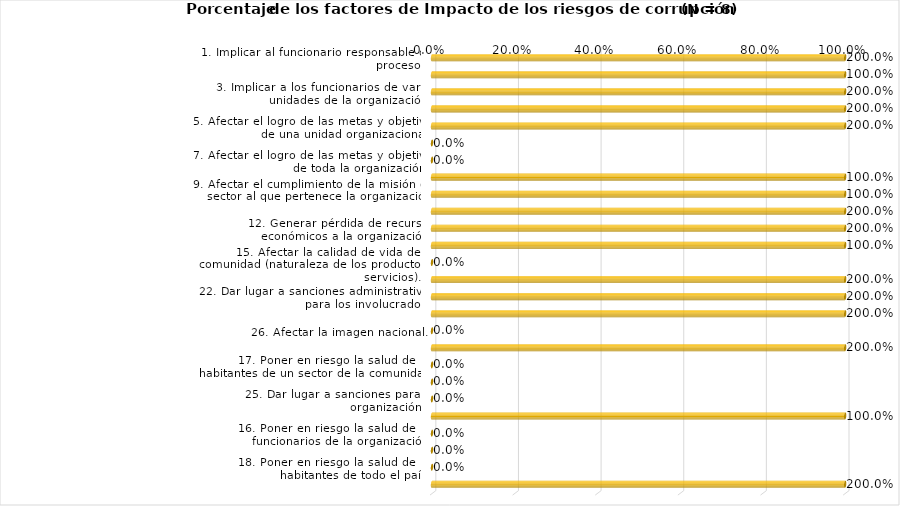
| Category | Series 0 |
|---|---|
| 1. Implicar al funcionario responsable del proceso. | 2 |
| 2. Implicar a los funcionarios de una unidad organizacional. | 1 |
| 3. Implicar a los funcionarios de varias unidades de la organización. | 2 |
| 4. Afectar el logro de las metas y objetivos del proceso. | 2 |
| 5. Afectar el logro de las metas y objetivos de una unidad organizacional. | 2 |
| 6. Afectar el logro de las metas y objetivos de varias unidades de la organización. | 0 |
| 7. Afectar el logro de las metas y objetivos de toda la organización. | 0 |
| 8. Afectar el cumplimiento de la misión de la organización. | 1 |
| 9. Afectar el cumplimiento de la misión del sector al que pertenece la organización. | 1 |
| 10. Generar pérdida de confianza en la organización. | 2 |
| 12. Generar pérdida de recursos económicos a la organización. | 2 |
| 13. Generar pérdida de información para la organización. | 1 |
| 15. Afectar la calidad de vida de la comunidad (naturaleza de los productos / servicios).  | 0 |
| 21. Generar intervención de los órganos de control (Fiscalía, u otro ente). | 2 |
| 22. Dar lugar a sanciones administrativas para los involucrados. | 2 |
| 23. Dar lugar a sanciones penales para los involucrados. | 2 |
| 26. Afectar la imagen nacional. | 0 |
| 11. Generar pérdida de confianza en el sector al que pertenece la organización. | 2 |
| 17. Poner en riesgo la salud de los habitantes de un sector de la comunidad. | 0 |
| 20. Poner en riesgo de muerte a los habitantes de la comunidad. | 0 |
| 25. Dar lugar a sanciones para la organización. | 0 |
| 14. Afectar la calidad / costo de los productos / servicios que presta la organización. | 1 |
| 16. Poner en riesgo la salud de los funcionarios de la organización. | 0 |
| 19. Poner en riesgo de muerte a los funcionarios de la organización. | 0 |
| 18. Poner en riesgo la salud de los habitantes de todo el país. | 0 |
| 24. Dar lugar a sanciones fiscales (tributarias) para los involucrados. | 2 |